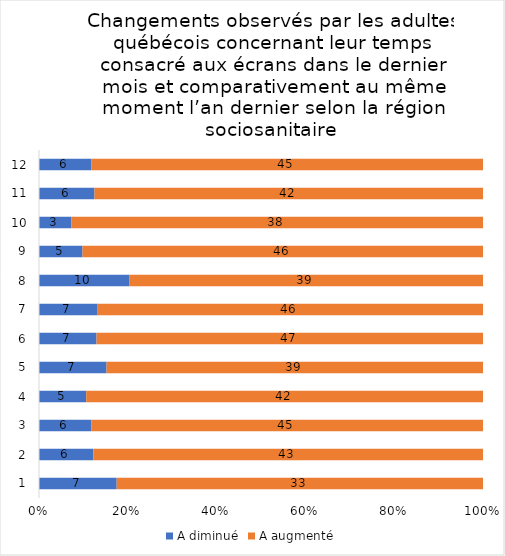
| Category | A diminué | A augmenté |
|---|---|---|
| 0 | 7 | 33 |
| 1 | 6 | 43 |
| 2 | 6 | 45 |
| 3 | 5 | 42 |
| 4 | 7 | 39 |
| 5 | 7 | 47 |
| 6 | 7 | 46 |
| 7 | 10 | 39 |
| 8 | 5 | 46 |
| 9 | 3 | 38 |
| 10 | 6 | 42 |
| 11 | 6 | 45 |